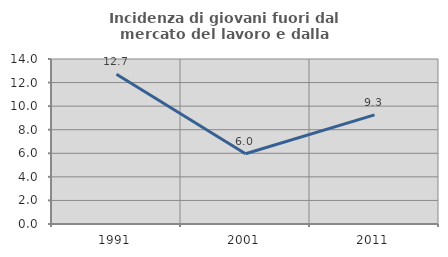
| Category | Incidenza di giovani fuori dal mercato del lavoro e dalla formazione  |
|---|---|
| 1991.0 | 12.704 |
| 2001.0 | 5.96 |
| 2011.0 | 9.255 |